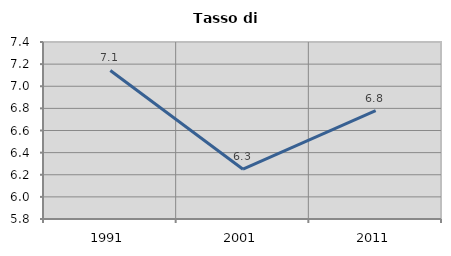
| Category | Tasso di disoccupazione   |
|---|---|
| 1991.0 | 7.143 |
| 2001.0 | 6.25 |
| 2011.0 | 6.78 |